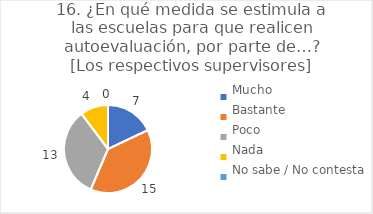
| Category | 16. ¿En qué medida se estimula a las escuelas para que realicen autoevaluación, por parte de…?
[Los respectivos supervisores] |
|---|---|
| Mucho  | 0.179 |
| Bastante  | 0.385 |
| Poco  | 0.333 |
| Nada  | 0.103 |
| No sabe / No contesta | 0 |